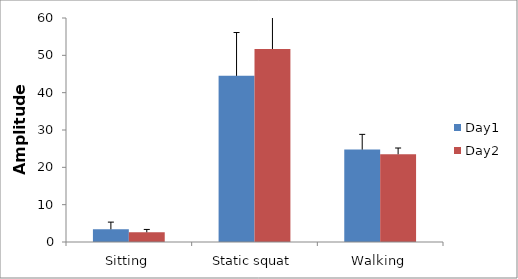
| Category | Day1 | Day2 |
|---|---|---|
| Sitting | 3.4 | 2.6 |
| Static squat | 44.5 | 51.7 |
| Walking | 24.75 | 23.5 |